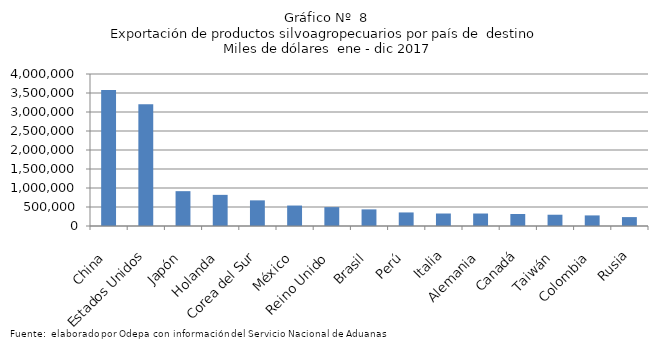
| Category | Series 0 |
|---|---|
| China | 3581069.911 |
| Estados Unidos | 3200800.237 |
| Japón | 916782.431 |
| Holanda | 819376.239 |
| Corea del Sur | 674801.341 |
| México | 538421.223 |
| Reino Unido | 496808.879 |
| Brasil | 437057.55 |
| Perú | 356764.974 |
| Italia | 328774.761 |
| Alemania | 328512.87 |
| Canadá | 315550.801 |
| Taiwán | 296688.402 |
| Colombia | 278701.113 |
| Rusia | 234454.729 |